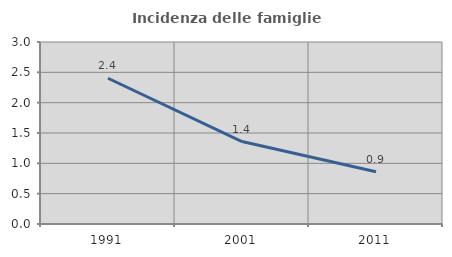
| Category | Incidenza delle famiglie numerose |
|---|---|
| 1991.0 | 2.402 |
| 2001.0 | 1.359 |
| 2011.0 | 0.86 |